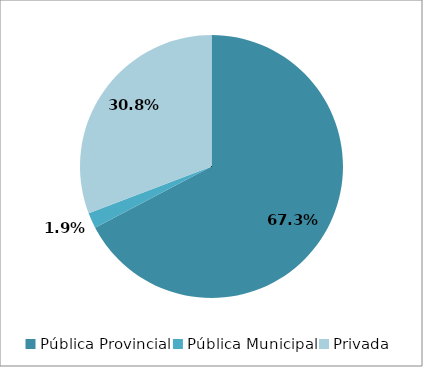
| Category | Series 0 | Series 1 | Series 2 |
|---|---|---|---|
| Pública Provincial | 0.673 | 0.673 | 224 |
| Pública Municipal | 0.019 | 0.019 | 156 |
| Privada | 0.308 | 0.308 | 285 |